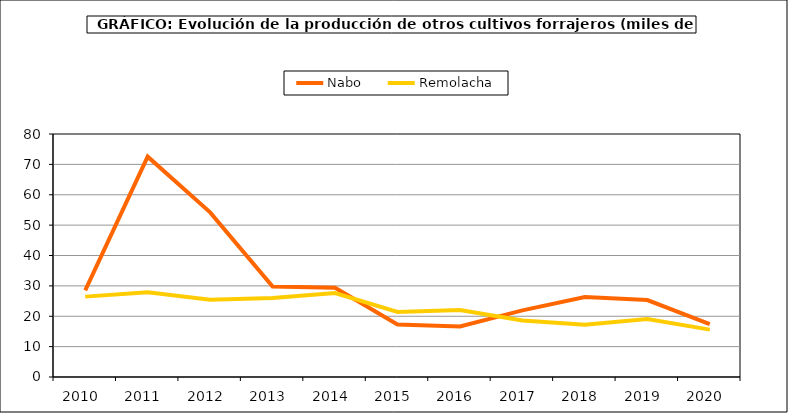
| Category | Nabo | Remolacha |
|---|---|---|
| 2010.0 | 28.523 | 26.462 |
| 2011.0 | 72.547 | 27.888 |
| 2012.0 | 54.203 | 25.459 |
| 2013.0 | 29.799 | 26.019 |
| 2014.0 | 29.363 | 27.616 |
| 2015.0 | 17.256 | 21.393 |
| 2016.0 | 16.64 | 22.03 |
| 2017.0 | 21.935 | 18.58 |
| 2018.0 | 26.306 | 17.228 |
| 2019.0 | 25.326 | 19.097 |
| 2020.0 | 17.381 | 15.594 |